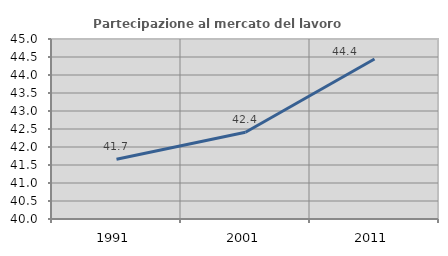
| Category | Partecipazione al mercato del lavoro  femminile |
|---|---|
| 1991.0 | 41.66 |
| 2001.0 | 42.41 |
| 2011.0 | 44.446 |